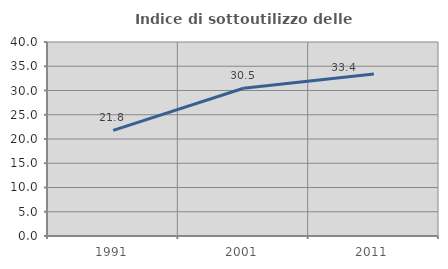
| Category | Indice di sottoutilizzo delle abitazioni  |
|---|---|
| 1991.0 | 21.791 |
| 2001.0 | 30.456 |
| 2011.0 | 33.4 |